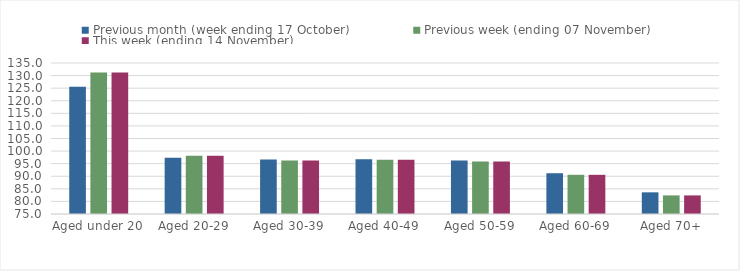
| Category | Previous month (week ending 17 October) | Previous week (ending 07 November) | This week (ending 14 November) |
|---|---|---|---|
| Aged under 20 | 125.53 | 131.23 | 131.23 |
| Aged 20-29 | 97.39 | 98.14 | 98.14 |
| Aged 30-39 | 96.67 | 96.24 | 96.24 |
| Aged 40-49 | 96.77 | 96.57 | 96.57 |
| Aged 50-59 | 96.24 | 95.83 | 95.82 |
| Aged 60-69 | 91.2 | 90.57 | 90.57 |
| Aged 70+ | 83.61 | 82.39 | 82.39 |